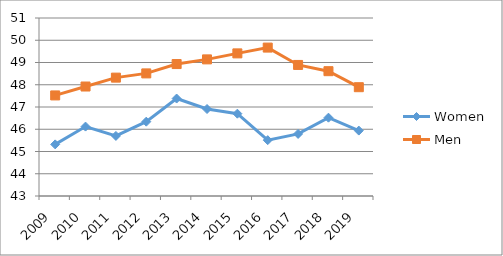
| Category | Women | Men |
|---|---|---|
| 2009.0 | 45.32 | 47.52 |
| 2010.0 | 46.12 | 47.92 |
| 2011.0 | 45.7 | 48.32 |
| 2012.0 | 46.34 | 48.51 |
| 2013.0 | 47.38 | 48.93 |
| 2014.0 | 46.91 | 49.14 |
| 2015.0 | 46.7 | 49.41 |
| 2016.0 | 45.51 | 49.67 |
| 2017.0 | 45.79 | 48.89 |
| 2018.0 | 46.52 | 48.61 |
| 2019.0 | 45.94 | 47.89 |